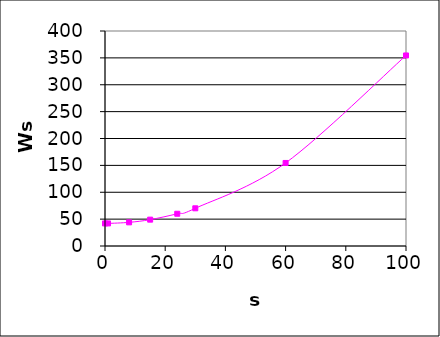
| Category | Series 1 |
|---|---|
| 100.0 | 354.5 |
| 60.0 | 154.5 |
| 30.0 | 70.125 |
| 24.0 | 60 |
| 15.0 | 49.03 |
| 8.0 | 44 |
| 1.0 | 42.03 |
| 0.0 | 42 |